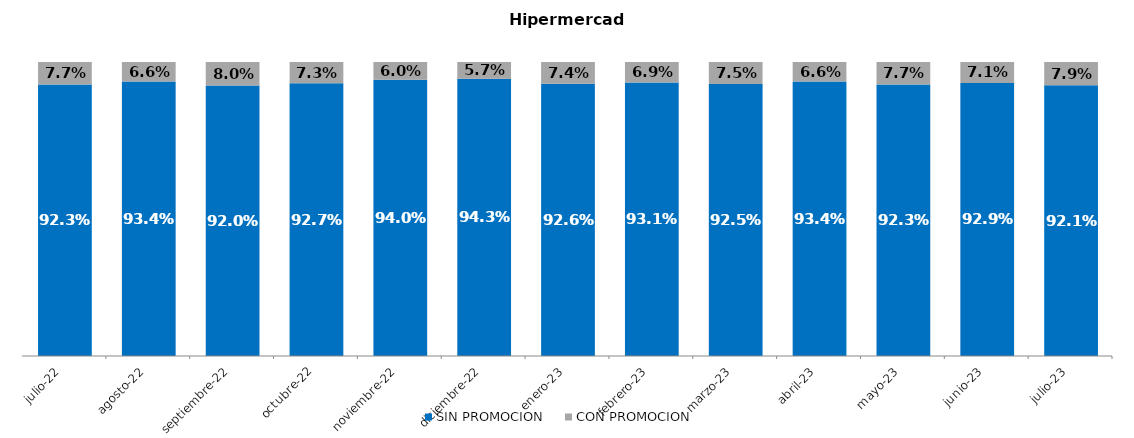
| Category | SIN PROMOCION   | CON PROMOCION   |
|---|---|---|
| 2022-07-01 | 0.923 | 0.077 |
| 2022-08-01 | 0.934 | 0.066 |
| 2022-09-01 | 0.92 | 0.08 |
| 2022-10-01 | 0.927 | 0.073 |
| 2022-11-01 | 0.94 | 0.06 |
| 2022-12-01 | 0.943 | 0.057 |
| 2023-01-01 | 0.926 | 0.074 |
| 2023-02-01 | 0.931 | 0.069 |
| 2023-03-01 | 0.925 | 0.075 |
| 2023-04-01 | 0.934 | 0.066 |
| 2023-05-01 | 0.923 | 0.077 |
| 2023-06-01 | 0.929 | 0.071 |
| 2023-07-01 | 0.921 | 0.079 |